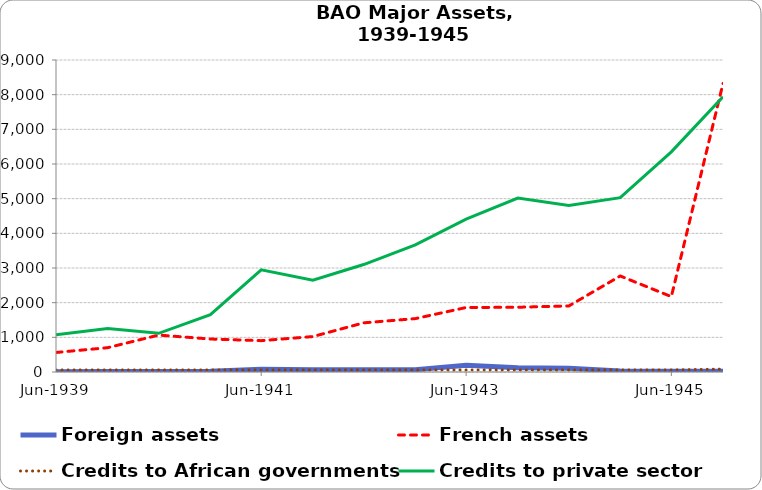
| Category | Foreign assets | French assets | Credits to African governments | Credits to private sector |
|---|---|---|---|---|
| 1939-06-30 | 7.008 | 563.024 | 59.65 | 1074.322 |
| 1939-12-31 | 13.256 | 701.555 | 59.65 | 1252.339 |
| 1940-06-30 | 11.352 | 1064.882 | 59.65 | 1115.042 |
| 1940-12-31 | 19.407 | 951.3 | 59.65 | 1654.153 |
| 1941-06-30 | 81.727 | 903.994 | 59.65 | 2947.138 |
| 1941-12-31 | 63.551 | 1022.114 | 59.65 | 2645.033 |
| 1942-06-30 | 64.395 | 1417.97 | 59.65 | 3100.127 |
| 1942-12-31 | 66.774 | 1539.707 | 59.65 | 3667.782 |
| 1943-06-30 | 194.686 | 1860.733 | 59.65 | 4411.949 |
| 1943-12-31 | 124.769 | 1867.654 | 59.65 | 5016.288 |
| 1944-06-30 | 105.578 | 1905.852 | 59.65 | 4800.661 |
| 1944-12-30 | 26.629 | 2769.633 | 59.65 | 5030.194 |
| 1945-06-30 | 21.161 | 2174.219 | 59.65 | 6350.959 |
| 1945-12-31 | 24.937 | 8322.337 | 83.905 | 7939.975 |